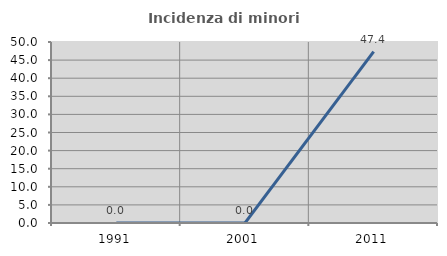
| Category | Incidenza di minori stranieri |
|---|---|
| 1991.0 | 0 |
| 2001.0 | 0 |
| 2011.0 | 47.368 |